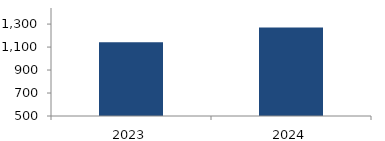
| Category | Cuenta propia  |
|---|---|
| 2023.0 | 1141.325 |
| 2024.0 | 1270.258 |